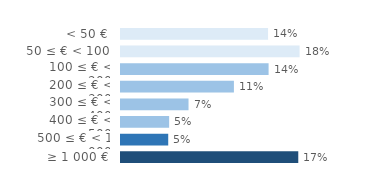
| Category | Series 0 |
|---|---|
| < 50 € | 0.144 |
| 50 ≤ € < 100 | 0.175 |
| 100 ≤ € < 200 | 0.145 |
| 200 ≤ € < 300 | 0.111 |
| 300 ≤ € < 400 | 0.066 |
| 400 ≤ € < 500 | 0.047 |
| 500 ≤ € < 1 000 | 0.046 |
| ≥ 1 000 € | 0.174 |